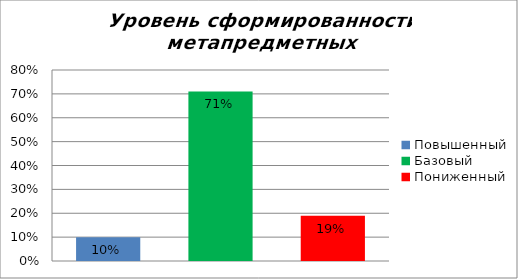
| Category | Уровень сформированности метапредметных результатов |
|---|---|
| Повышенный | 0.1 |
| Базовый | 0.71 |
| Пониженный | 0.19 |